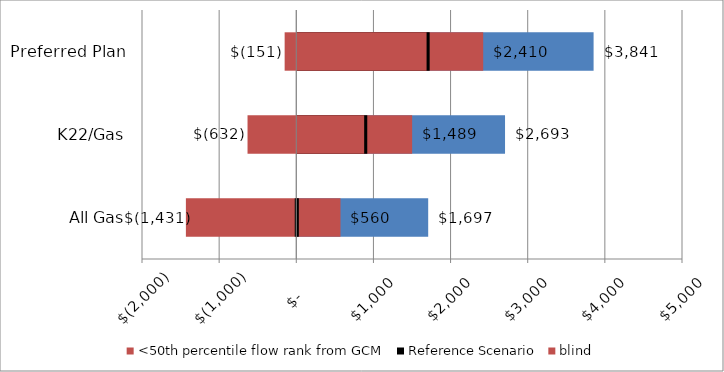
| Category | >50th percentile flow rank from GCM | <50th percentile flow rank from GCM | 50th | Reference Scenario | blind |
|---|---|---|---|---|---|
| All Gas | 1697 | -1431 | 560 | -20 | 20 |
| K22/Gas | 2693 | -632 | 1489 | 907 | 867 |
| Preferred Plan | 3841 | -151 | 2410 | 1716 | 1676 |